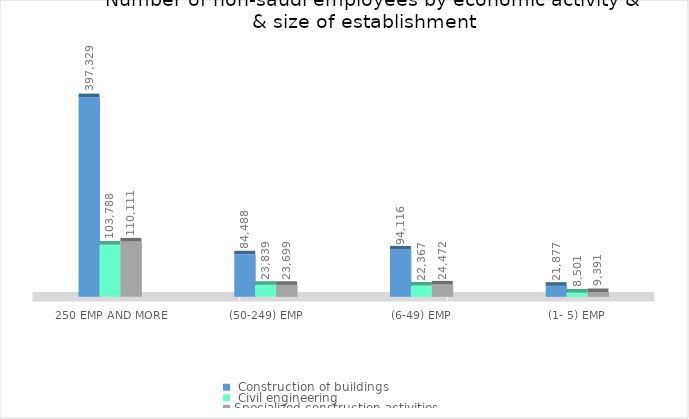
| Category |  Construction of buildings |  Civil engineering | Specialized construction activities |
|---|---|---|---|
|  (1- 5) emp  | 21877.274 | 8500.656 | 9391.439 |
|  (6-49) emp  | 94115.674 | 22366.684 | 24472.088 |
|  (50-249) emp  | 84487.919 | 23839.09 | 23698.588 |
|  250 emp and more  | 397328.697 | 103788.183 | 110111.471 |